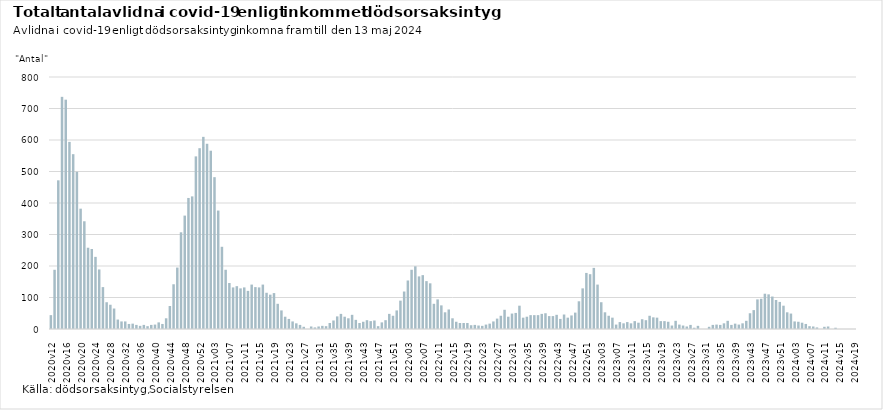
| Category | Series 0 |
|---|---|
| 2020v12 | 44 |
| 2020v13 | 188 |
| 2020v14 | 472 |
| 2020v15 | 737 |
| 2020v16 | 728 |
| 2020v17 | 594 |
| 2020v18 | 555 |
| 2020v19 | 499 |
| 2020v20 | 382 |
| 2020v21 | 342 |
| 2020v22 | 258 |
| 2020v23 | 254 |
| 2020v24 | 229 |
| 2020v25 | 189 |
| 2020v26 | 133 |
| 2020v27 | 85 |
| 2020v28 | 77 |
| 2020v29 | 65 |
| 2020v30 | 30 |
| 2020v31 | 24 |
| 2020v32 | 24 |
| 2020v33 | 16 |
| 2020v34 | 17 |
| 2020v35 | 13 |
| 2020v36 | 10 |
| 2020v37 | 13 |
| 2020v38 | 9 |
| 2020v39 | 13 |
| 2020v40 | 14 |
| 2020v41 | 21 |
| 2020v42 | 16 |
| 2020v43 | 34 |
| 2020v44 | 73 |
| 2020v45 | 142 |
| 2020v46 | 195 |
| 2020v47 | 307 |
| 2020v48 | 360 |
| 2020v49 | 416 |
| 2020v50 | 421 |
| 2020v51 | 548 |
| 2020v52 | 574 |
| 2020v53 | 610 |
| 2021v01 | 588 |
| 2021v02 | 566 |
| 2021v03 | 482 |
| 2021v04 | 376 |
| 2021v05 | 261 |
| 2021v06 | 188 |
| 2021v07 | 146 |
| 2021v08 | 132 |
| 2021v09 | 136 |
| 2021v10 | 129 |
| 2021v11 | 132 |
| 2021v12 | 121 |
| 2021v13 | 141 |
| 2021v14 | 133 |
| 2021v15 | 132 |
| 2021v16 | 141 |
| 2021v17 | 115 |
| 2021v18 | 109 |
| 2021v19 | 114 |
| 2021v20 | 80 |
| 2021v21 | 59 |
| 2021v22 | 39 |
| 2021v23 | 32 |
| 2021v24 | 24 |
| 2021v25 | 18 |
| 2021v26 | 13 |
| 2021v27 | 7 |
| 2021v28 | 0 |
| 2021v29 | 8 |
| 2021v30 | 5 |
| 2021v31 | 8 |
| 2021v32 | 10 |
| 2021v33 | 9 |
| 2021v34 | 19 |
| 2021v35 | 27 |
| 2021v36 | 40 |
| 2021v37 | 48 |
| 2021v38 | 39 |
| 2021v39 | 34 |
| 2021v40 | 45 |
| 2021v41 | 29 |
| 2021v42 | 19 |
| 2021v43 | 23 |
| 2021v44 | 28 |
| 2021v45 | 25 |
| 2021v46 | 27 |
| 2021v47 | 9 |
| 2021v48 | 21 |
| 2021v49 | 28 |
| 2021v50 | 48 |
| 2021v51 | 42 |
| 2021v52 | 59 |
| 2022v01 | 90 |
| 2022v02 | 119 |
| 2022v03 | 154 |
| 2022v04 | 188 |
| 2022v05 | 199 |
| 2022v06 | 167 |
| 2022v07 | 171 |
| 2022v08 | 152 |
| 2022v09 | 145 |
| 2022v10 | 80 |
| 2022v11 | 94 |
| 2022v12 | 75 |
| 2022v13 | 53 |
| 2022v14 | 62 |
| 2022v15 | 34 |
| 2022v16 | 23 |
| 2022v17 | 19 |
| 2022v18 | 19 |
| 2022v19 | 19 |
| 2022v20 | 12 |
| 2022v21 | 13 |
| 2022v22 | 11 |
| 2022v23 | 10 |
| 2022v24 | 14 |
| 2022v25 | 17 |
| 2022v26 | 24 |
| 2022v27 | 33 |
| 2022v28 | 42 |
| 2022v29 | 61 |
| 2022v30 | 39 |
| 2022v31 | 49 |
| 2022v32 | 51 |
| 2022v33 | 74 |
| 2022v34 | 36 |
| 2022v35 | 39 |
| 2022v36 | 44 |
| 2022v37 | 44 |
| 2022v38 | 44 |
| 2022v39 | 48 |
| 2022v40 | 50 |
| 2022v41 | 41 |
| 2022v42 | 41 |
| 2022v43 | 45 |
| 2022v44 | 32 |
| 2022v45 | 46 |
| 2022v46 | 36 |
| 2022v47 | 43 |
| 2022v48 | 52 |
| 2022v49 | 88 |
| 2022v50 | 129 |
| 2022v51 | 178 |
| 2022v52 | 174 |
| 2023v01 | 194 |
| 2023v02 | 141 |
| 2023v03 | 85 |
| 2023v04 | 53 |
| 2023v05 | 42 |
| 2023v06 | 36 |
| 2023v07 | 14 |
| 2023v08 | 22 |
| 2023v09 | 18 |
| 2023v10 | 22 |
| 2023v11 | 18 |
| 2023v12 | 25 |
| 2023v13 | 20 |
| 2023v14 | 31 |
| 2023v15 | 28 |
| 2023v16 | 42 |
| 2023v17 | 37 |
| 2023v18 | 36 |
| 2023v19 | 25 |
| 2023v20 | 25 |
| 2023v21 | 23 |
| 2023v22 | 11 |
| 2023v23 | 26 |
| 2023v24 | 14 |
| 2023v25 | 11 |
| 2023v26 | 8 |
| 2023v27 | 13 |
| 2023v28 | 4 |
| 2023v29 | 10 |
| 2023v30 | 0 |
| 2023v31 | 0 |
| 2023v32 | 7 |
| 2023v33 | 13 |
| 2023v34 | 14 |
| 2023v35 | 13 |
| 2023v36 | 18 |
| 2023v37 | 26 |
| 2023v38 | 13 |
| 2023v39 | 17 |
| 2023v40 | 14 |
| 2023v41 | 18 |
| 2023v42 | 26 |
| 2023v43 | 50 |
| 2023v44 | 60 |
| 2023v45 | 94 |
| 2023v46 | 96 |
| 2023v47 | 112 |
| 2023v48 | 110 |
| 2023v49 | 103 |
| 2023v50 | 92 |
| 2023v51 | 86 |
| 2023v52 | 74 |
| 2024v01 | 53 |
| 2024v02 | 49 |
| 2024v03 | 24 |
| 2024v04 | 23 |
| 2024v05 | 20 |
| 2024v06 | 16 |
| 2024v07 | 9 |
| 2024v08 | 8 |
| 2024v09 | 5 |
| 2024v10 | 0 |
| 2024v11 | 7 |
| 2024v12 | 8 |
| 2024v13 | 0 |
| 2024v14 | 4 |
| 2024v15 | 0 |
| 2024v16 | 0 |
| 2024v17 | 0 |
| 2024v18 | 0 |
| 2024v19 | 0 |